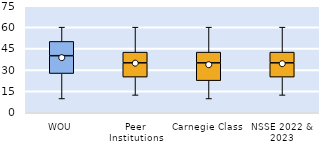
| Category | 25th | 50th | 75th |
|---|---|---|---|
| WOU | 27.5 | 12.5 | 10 |
| Peer Institutions | 25 | 10 | 7.5 |
| Carnegie Class | 22.5 | 12.5 | 7.5 |
| NSSE 2022 & 2023 | 25 | 10 | 7.5 |